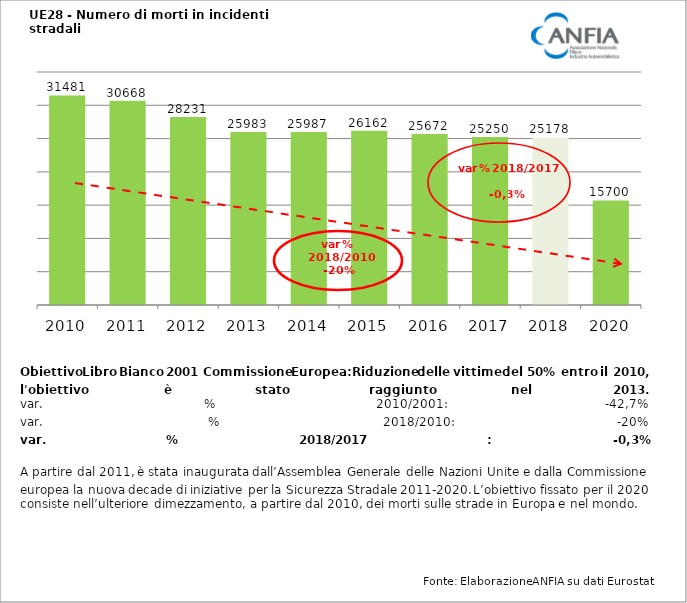
| Category | Series 0 |
|---|---|
| 2010.0 | 31481 |
| 2011.0 | 30668 |
| 2012.0 | 28231 |
| 2013.0 | 25983 |
| 2014.0 | 25987 |
| 2015.0 | 26162 |
| 2016.0 | 25672 |
| 2017.0 | 25250 |
| 2018.0 | 25178 |
| 2020.0 | 15700 |